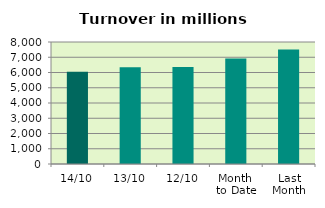
| Category | Series 0 |
|---|---|
| 14/10 | 6048.857 |
| 13/10 | 6349.311 |
| 12/10 | 6358.872 |
| Month 
to Date | 6917.601 |
| Last
Month | 7507.246 |